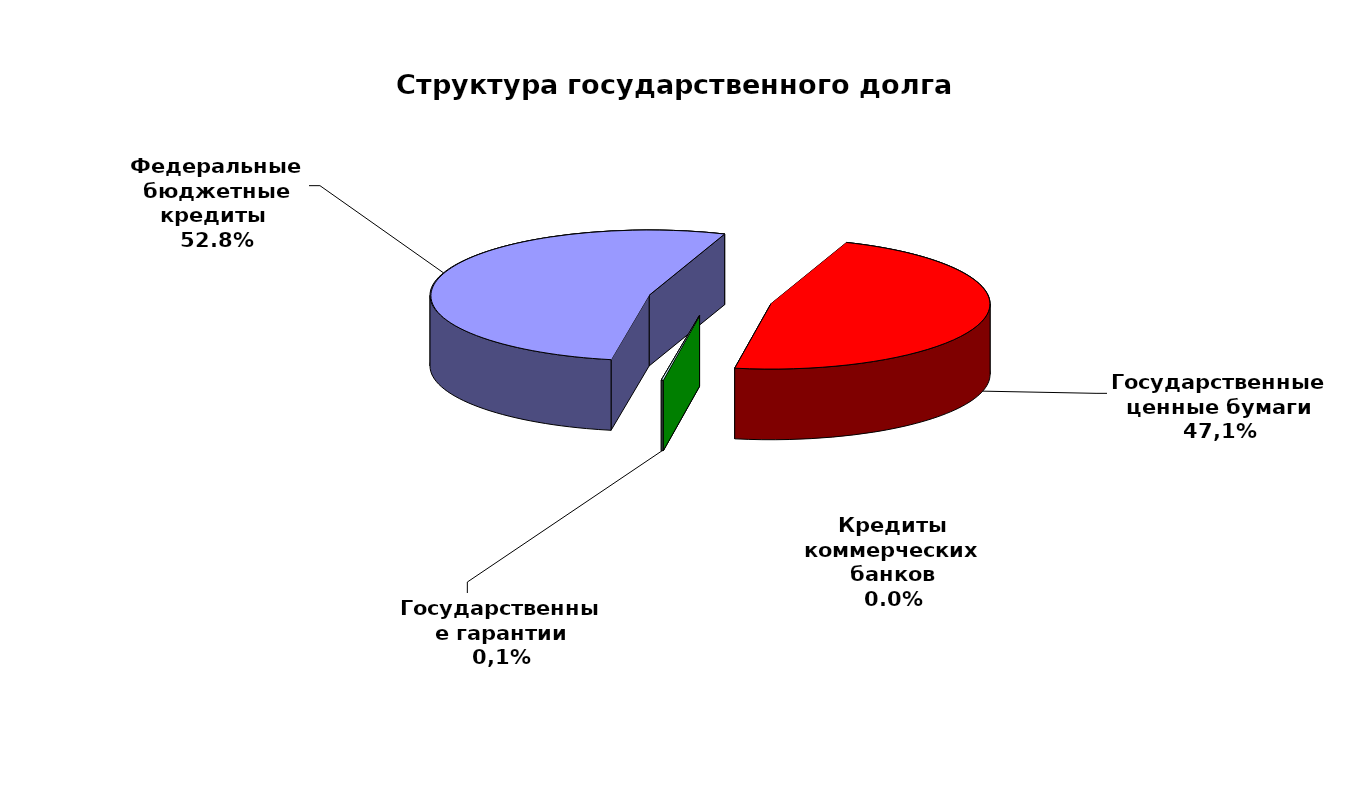
| Category | Series 0 |
|---|---|
| Федеральные бюджетные кредиты  | 55700753.113 |
| Государственные ценные бумаги | 49600000 |
| Кредиты коммерческих банков | 0 |
| Государственные гарантии | 139748.87 |